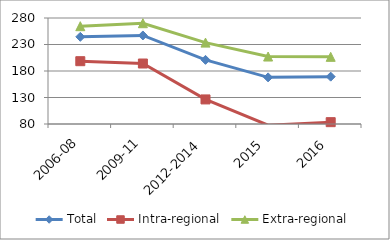
| Category | Total | Intra-regional | Extra-regional |
|---|---|---|---|
| 2006-08 | 244.489 | 198.505 | 264.533 |
| 2009-11 | 247.064 | 194.094 | 270.154 |
| 2012-2014 | 201.006 | 126.37 | 233.539 |
| 2015 | 167.982 | 77.787 | 207.297 |
| 2016 | 169.313 | 83.467 | 206.733 |